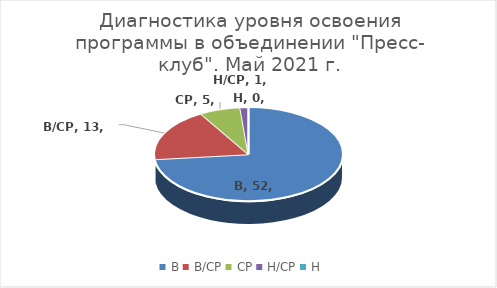
| Category | Series 0 |
|---|---|
| В | 52 |
| В/СР | 13 |
| СР | 5 |
| Н/СР | 1 |
| Н | 0 |